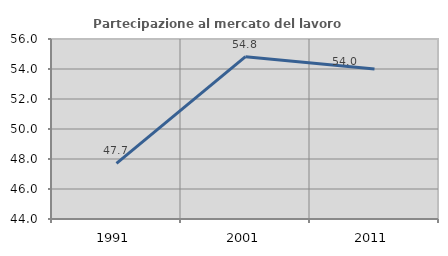
| Category | Partecipazione al mercato del lavoro  femminile |
|---|---|
| 1991.0 | 47.705 |
| 2001.0 | 54.822 |
| 2011.0 | 54.002 |